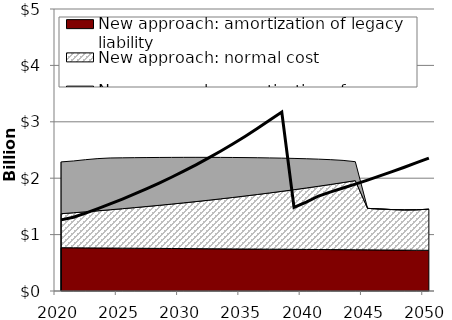
| Category | Current paradigm |
|---|---|
| 2020.0 | 1260469 |
| 2021.0 | 1308727 |
| 2022.0 | 1380488 |
| 2023.0 | 1460038 |
| 2024.0 | 1543536 |
| 2025.0 | 1630514 |
| 2026.0 | 1721146 |
| 2027.0 | 1815644 |
| 2028.0 | 1914239 |
| 2029.0 | 2017180 |
| 2030.0 | 2124726 |
| 2031.0 | 2237147 |
| 2032.0 | 2354720 |
| 2033.0 | 2477719 |
| 2034.0 | 2606390 |
| 2035.0 | 2740905 |
| 2036.0 | 2881226 |
| 2037.0 | 3026635 |
| 2038.0 | 3172935 |
| 2039.0 | 1482179 |
| 2040.0 | 1576219 |
| 2041.0 | 1684110 |
| 2042.0 | 1757716 |
| 2043.0 | 1825804 |
| 2044.0 | 1895194 |
| 2045.0 | 1966780 |
| 2046.0 | 2040589 |
| 2047.0 | 2116577 |
| 2048.0 | 2194661 |
| 2049.0 | 2274737 |
| 2050.0 | 2356677 |